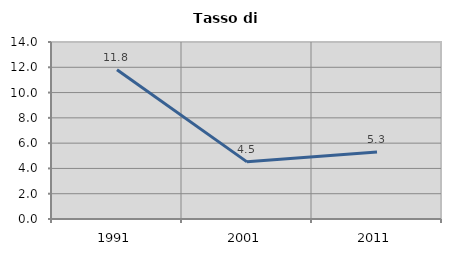
| Category | Tasso di disoccupazione   |
|---|---|
| 1991.0 | 11.807 |
| 2001.0 | 4.52 |
| 2011.0 | 5.292 |